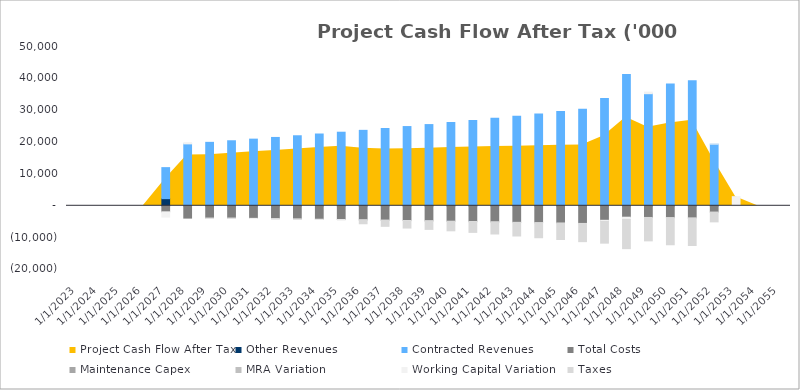
| Category | Other Revenues | Contracted Revenues | Total Costs | Maintenance Capex | MRA Variation | Working Capital Variation | Taxes |
|---|---|---|---|---|---|---|---|
| 12/31/23 | 0 | 0 | 0 | 0 | 0 | 0 | 0 |
| 12/31/24 | 0 | 0 | 0 | 0 | 0 | 0 | 0 |
| 12/31/25 | 0 | 0 | 0 | 0 | 0 | 0 | 0 |
| 12/31/26 | 0 | 0 | 0 | 0 | 0 | 0 | 0 |
| 12/31/27 | 2235.549 | 9742.664 | -1899.535 | 0 | 0 | -1643.263 | 0 |
| 12/31/28 | 0 | 19433.697 | -3866.471 | 0 | 0 | 367.261 | 0 |
| 12/31/29 | 0 | 19913.946 | -3873.244 | 0 | 0 | -42.412 | 0 |
| 12/31/30 | 0 | 20411.794 | -3874.519 | 0 | 0 | -40.814 | 0 |
| 12/31/31 | 0 | 20922.089 | -3948.703 | 0 | 0 | -35.845 | 0 |
| 12/31/32 | 0 | 21451.166 | -4051.57 | 0 | 0 | -31.124 | 0 |
| 12/31/33 | 0 | 21981.27 | -4134.454 | 0 | 0 | -40.665 | 0 |
| 12/31/34 | 0 | 22530.802 | -4230.615 | 0 | 0 | -37.263 | 0 |
| 12/31/35 | 0 | 23094.072 | -4329.036 | 0 | 0 | -38.207 | 0 |
| 12/31/36 | 0 | 23678.073 | -4441.908 | 0 | 0 | -34.403 | -1163.908 |
| 12/31/37 | 0 | 24263.209 | -4532.875 | 0 | 0 | -44.936 | -1867.953 |
| 12/31/38 | 0 | 24869.789 | -4638.403 | 0 | 0 | -41.182 | -2304.702 |
| 12/31/39 | 0 | 25491.534 | -4746.413 | 0 | 0 | -42.225 | -2624.081 |
| 12/31/40 | 0 | 26136.162 | -4870.272 | 0 | 0 | -38.027 | -2947.372 |
| 12/31/41 | 0 | 26782.043 | -4970.119 | 0 | 0 | -49.655 | -3329.781 |
| 12/31/42 | 0 | 27451.594 | -5085.935 | 0 | 0 | -45.512 | -3720.702 |
| 12/31/43 | 0 | 28137.884 | -5204.479 | 0 | 0 | -46.664 | -4233.615 |
| 12/31/44 | 0 | 28849.433 | -5340.405 | 0 | 0 | -42.032 | -4644.663 |
| 12/31/45 | 0 | 29562.364 | -5450.007 | 0 | 0 | -54.868 | -5083.445 |
| 12/31/46 | 0 | 30301.423 | -5542.632 | 0 | 0 | -53.132 | -5657.111 |
| 12/31/47 | 0 | 33701.669 | -4554.754 | 0 | 0 | -360.668 | -6811.105 |
| 12/31/48 | 0 | 41237.982 | -3587.103 | 0 | 0 | -690.501 | -9173.305 |
| 12/31/49 | 0 | 35185.418 | -3666.735 | 0 | 0 | 495.561 | -7342.005 |
| 12/31/50 | 0 | 38217.052 | -3758.403 | 0 | 0 | -241.641 | -8233.701 |
| 12/31/51 | 0 | 39287.685 | -3852.363 | 0 | 0 | -80.275 | -8537.262 |
| 12/31/52 | 0 | 19358.964 | -1968.927 | 0 | 0 | 46.003 | -3076.414 |
| 12/31/53 | 0 | 0 | 0 | 0 | 0 | 2866.49 | 0 |
| 12/31/54 | 0 | 0 | 0 | 0 | 0 | 0 | 0 |
| 12/31/55 | 0 | 0 | 0 | 0 | 0 | 0 | 0 |
| 12/31/56 | 0 | 0 | 0 | 0 | 0 | 0 | 0 |
| 12/31/57 | 0 | 0 | 0 | 0 | 0 | 0 | 0 |
| 12/31/58 | 0 | 0 | 0 | 0 | 0 | 0 | 0 |
| 12/31/59 | 0 | 0 | 0 | 0 | 0 | 0 | 0 |
| 12/31/60 | 0 | 0 | 0 | 0 | 0 | 0 | 0 |
| 12/31/61 | 0 | 0 | 0 | 0 | 0 | 0 | 0 |
| 12/31/62 | 0 | 0 | 0 | 0 | 0 | 0 | 0 |
| 12/31/63 | 0 | 0 | 0 | 0 | 0 | 0 | 0 |
| 12/31/64 | 0 | 0 | 0 | 0 | 0 | 0 | 0 |
| 12/31/65 | 0 | 0 | 0 | 0 | 0 | 0 | 0 |
| 12/31/66 | 0 | 0 | 0 | 0 | 0 | 0 | 0 |
| 12/31/67 | 0 | 0 | 0 | 0 | 0 | 0 | 0 |
| 12/31/68 | 0 | 0 | 0 | 0 | 0 | 0 | 0 |
| 12/31/69 | 0 | 0 | 0 | 0 | 0 | 0 | 0 |
| 12/31/70 | 0 | 0 | 0 | 0 | 0 | 0 | 0 |
| 12/31/71 | 0 | 0 | 0 | 0 | 0 | 0 | 0 |
| 12/31/72 | 0 | 0 | 0 | 0 | 0 | 0 | 0 |
| 12/31/73 | 0 | 0 | 0 | 0 | 0 | 0 | 0 |
| 12/31/74 | 0 | 0 | 0 | 0 | 0 | 0 | 0 |
| 12/31/75 | 0 | 0 | 0 | 0 | 0 | 0 | 0 |
| 12/31/76 | 0 | 0 | 0 | 0 | 0 | 0 | 0 |
| 12/31/77 | 0 | 0 | 0 | 0 | 0 | 0 | 0 |
| 12/31/78 | 0 | 0 | 0 | 0 | 0 | 0 | 0 |
| 12/31/79 | 0 | 0 | 0 | 0 | 0 | 0 | 0 |
| 12/31/80 | 0 | 0 | 0 | 0 | 0 | 0 | 0 |
| 12/31/81 | 0 | 0 | 0 | 0 | 0 | 0 | 0 |
| 12/31/82 | 0 | 0 | 0 | 0 | 0 | 0 | 0 |